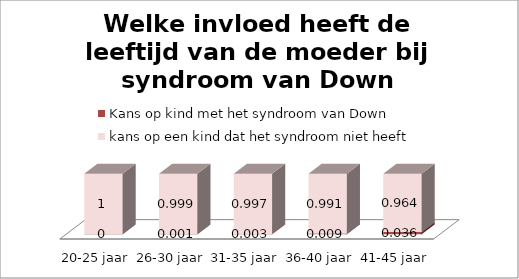
| Category | Kans op kind met het syndroom van Down  | kans op een kind dat het syndroom niet heeft |
|---|---|---|
| 20-25 jaar | 0 | 1 |
| 26-30 jaar | 0.001 | 0.999 |
| 31-35 jaar | 0.003 | 0.997 |
| 36-40 jaar | 0.009 | 0.991 |
| 41-45 jaar | 0.036 | 0.964 |